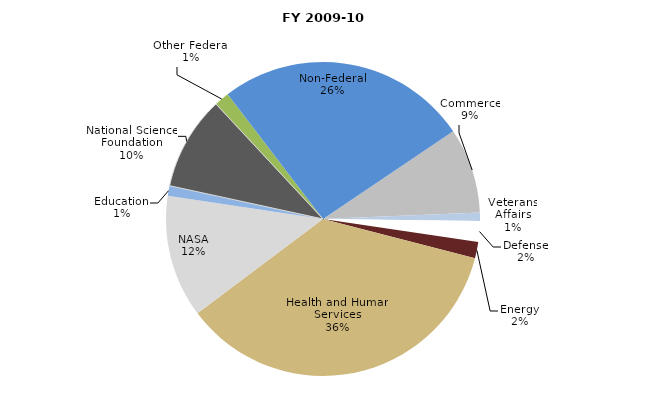
| Category | Series 0 |
|---|---|
| Commerce | 77761131.18 |
| Veterans Affairs | 7493778 |
| Defense | 19001530 |
| Energy | 14863068 |
| Health and Human Services | 315731015.57 |
| NASA | 111621356 |
| Education | 9181506 |
| National Science Foundation | 85458687 |
| Other Federal | 13666274.98 |
| Non-Federal | 229339863.9 |